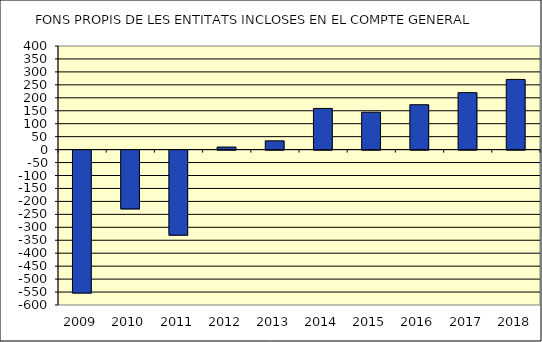
| Category | FONS PROPIS DE LES ENTITATS INCLOSES EN EL COMPTE GENERAL  |
|---|---|
| 2009.0 | -551.94 |
| 2010.0 | -227.04 |
| 2011.0 | -328.48 |
| 2012.0 | 9.89 |
| 2013.0 | 33.89 |
| 2014.0 | 159.03 |
| 2015.0 | 144.16 |
| 2016.0 | 173.24 |
| 2017.0 | 219.98 |
| 2018.0 | 270.9 |